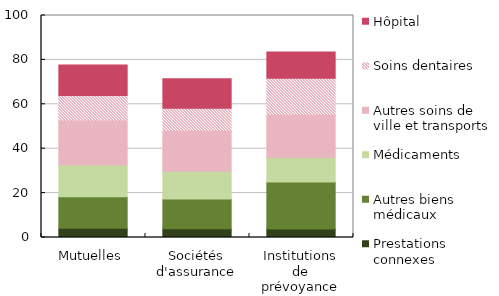
| Category | Prestations connexes | Autres biens médicaux | Médicaments | Autres soins de ville et transports | Soins dentaires | Hôpital |
|---|---|---|---|---|---|---|
| Mutuelles | 4.128 | 14.241 | 14.286 | 20.225 | 11.088 | 13.698 |
| Sociétés
d'assurance | 3.938 | 13.43 | 12.422 | 18.542 | 9.924 | 13.263 |
| Institutions de
prévoyance | 3.863 | 21.171 | 10.993 | 19.466 | 16.228 | 11.795 |